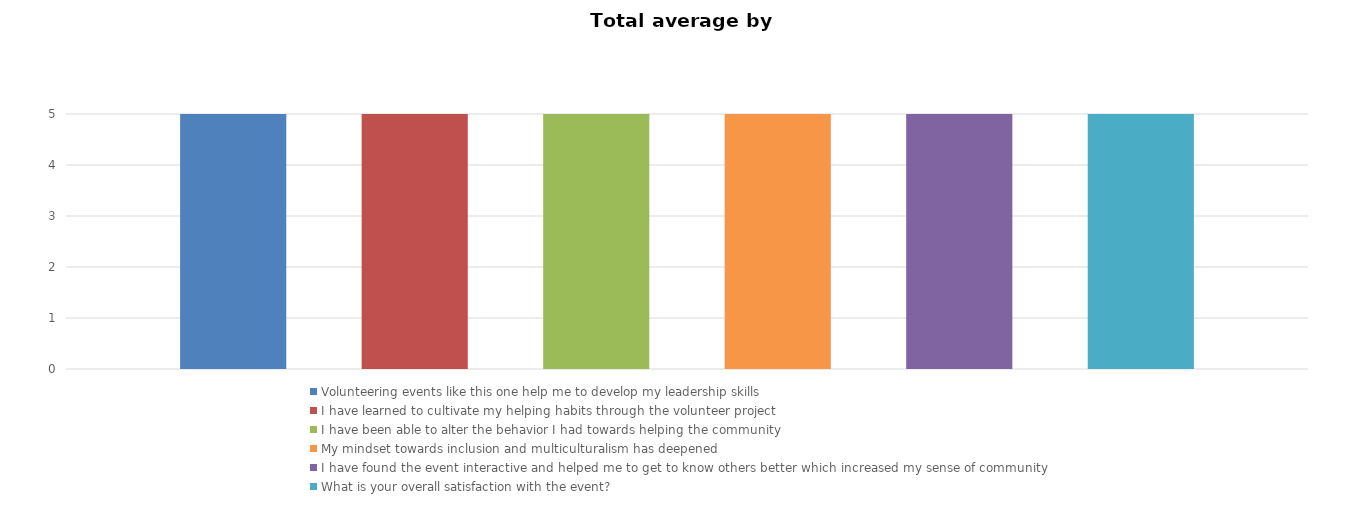
| Category | Volunteering events like this one help me to develop my leadership skills | I have learned to cultivate my helping habits through the volunteer project | I have been able to alter the behavior I had towards helping the community | My mindset towards inclusion and multiculturalism has deepened | I have found the event interactive and helped me to get to know others better which increased my sense of community | What is your overall satisfaction with the event? |
|---|---|---|---|---|---|---|
| 0 | 5 | 5 | 5 | 5 | 5 | 5 |